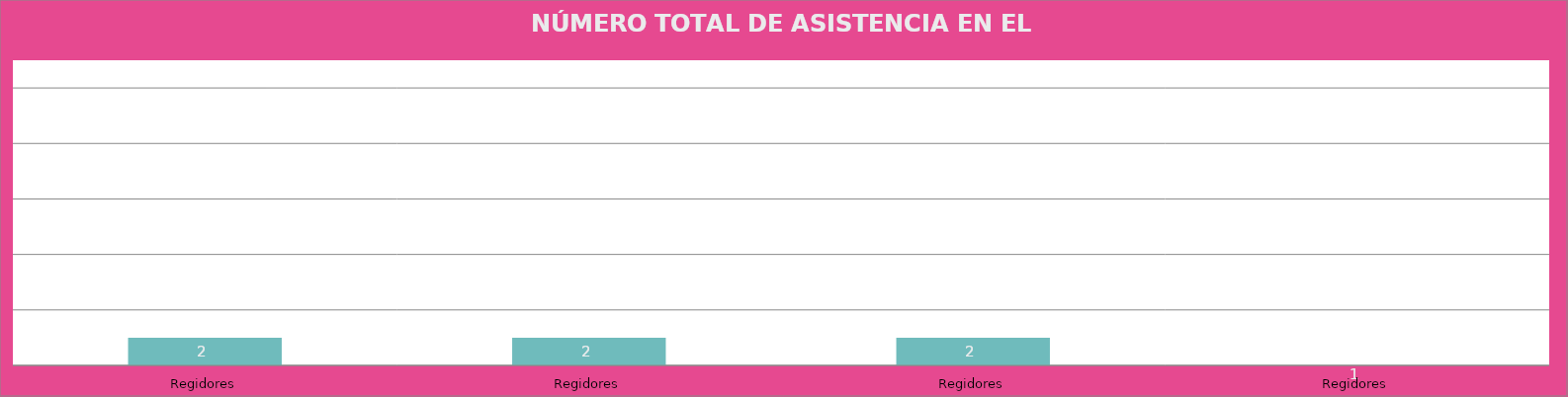
| Category | Regidores |
|---|---|
| Regidores | 2 |
| Regidores | 2 |
| Regidores | 2 |
| Regidores | 1 |